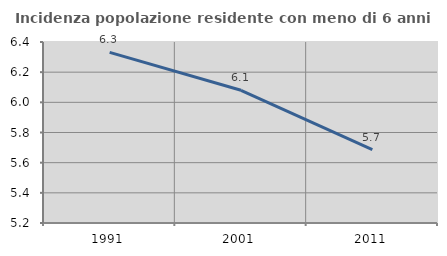
| Category | Incidenza popolazione residente con meno di 6 anni |
|---|---|
| 1991.0 | 6.331 |
| 2001.0 | 6.08 |
| 2011.0 | 5.687 |